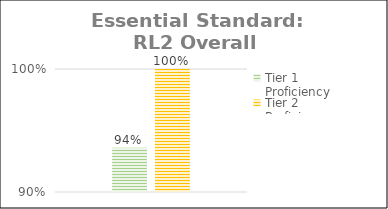
| Category | Tier 1 Proficiency | Tier 2 Proficiency |
|---|---|---|
| Total Class | 0.936 | 1 |